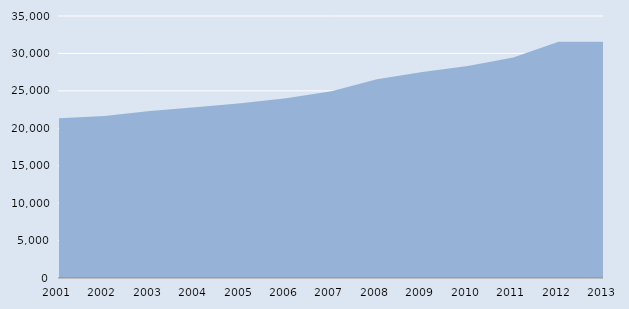
| Category | Series 0 |
|---|---|
| 2001.0 | 21331 |
| 2002.0 | 21657 |
| 2003.0 | 22324 |
| 2004.0 | 22795 |
| 2005.0 | 23337 |
| 2006.0 | 24005 |
| 2007.0 | 24950 |
| 2008.0 | 26541 |
| 2009.0 | 27532 |
| 2010.0 | 28310 |
| 2011.0 | 29453 |
| 2012.0 | 31560 |
| 2013.0 | 31564 |